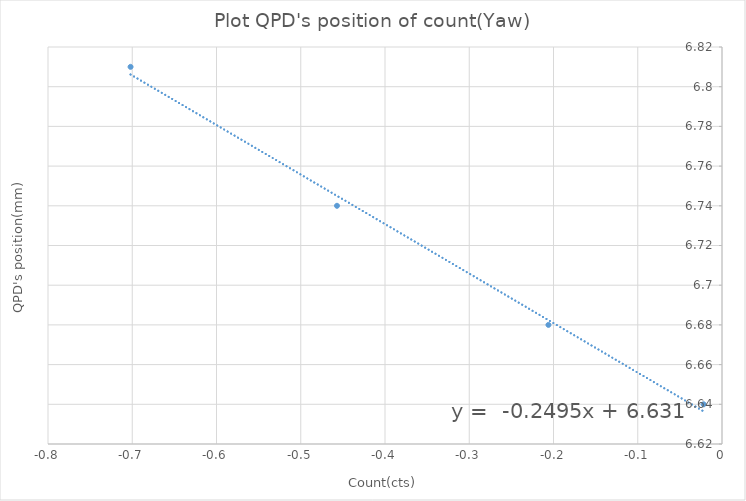
| Category | Series 0 |
|---|---|
| -0.0218 | 6.64 |
| -0.206 | 6.68 |
| -0.457 | 6.74 |
| -0.702 | 6.81 |